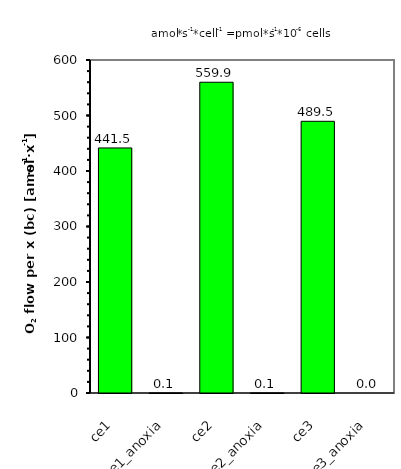
| Category | O2 flow per x (bc) |
|---|---|
| ce1 | 441.531 |
| ce1_anoxia | 0.075 |
| ce2 | 559.918 |
| ce2_anoxia | 0.083 |
| ce3 | 489.533 |
| ce3_anoxia | 0 |